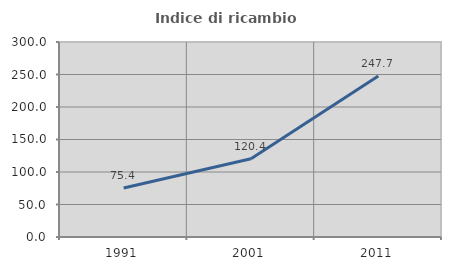
| Category | Indice di ricambio occupazionale  |
|---|---|
| 1991.0 | 75.41 |
| 2001.0 | 120.438 |
| 2011.0 | 247.744 |